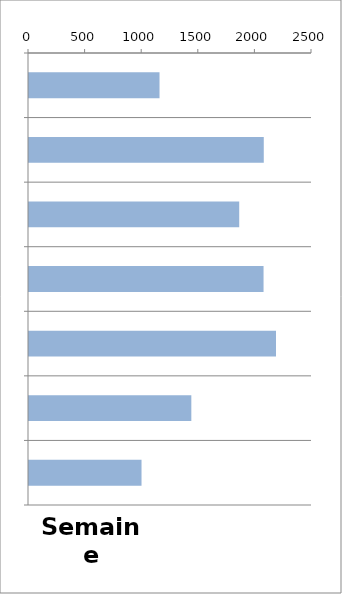
| Category | TV |
|---|---|
| 0 | 1153 |
| 1 | 2074 |
| 2 | 1857 |
| 3 | 2072 |
| 4 | 2182 |
| 5 | 1434 |
| 6 | 994 |